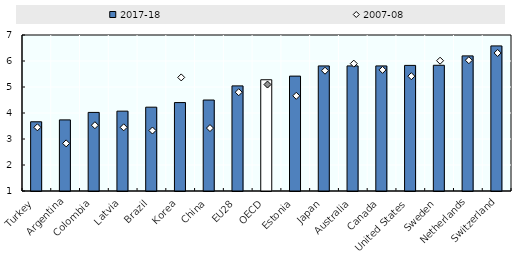
| Category | 2017-18 |
|---|---|
| Turkey | 3.662 |
| Argentina | 3.735 |
| Colombia | 4.023 |
| Latvia | 4.071 |
| Brazil | 4.224 |
| Korea | 4.401 |
| China | 4.499 |
| EU28 | 5.043 |
| OECD | 5.278 |
| Estonia | 5.419 |
| Japan | 5.811 |
| Australia | 5.811 |
| Canada | 5.811 |
| United States | 5.831 |
| Sweden | 5.835 |
| Netherlands | 6.197 |
| Switzerland | 6.58 |